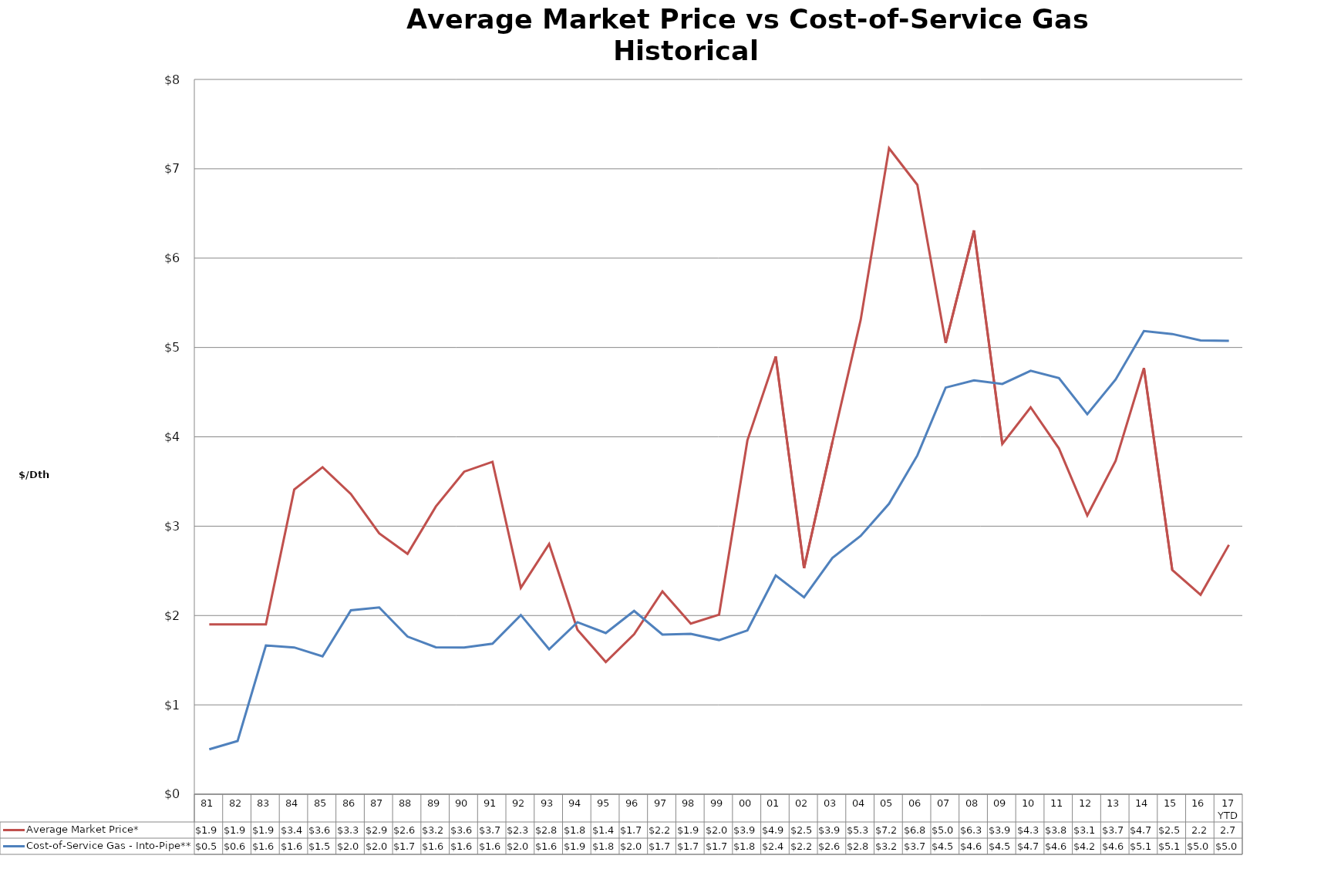
| Category | Average Market Price* | Cost-of-Service Gas - Into-Pipe** |
|---|---|---|
| 81 | 1.9 | 0.502 |
| 82 | 1.9 | 0.596 |
| 83 | 1.9 | 1.665 |
| 84 | 3.41 | 1.643 |
| 85 | 3.66 | 1.543 |
| 86 | 3.36 | 2.059 |
| 87 | 2.92 | 2.091 |
| 88 | 2.69 | 1.764 |
| 89 | 3.22 | 1.644 |
| 90 | 3.61 | 1.642 |
| 91 | 3.72 | 1.685 |
| 92 | 2.31 | 2.005 |
| 93 | 2.8 | 1.623 |
| 94 | 1.84 | 1.926 |
| 95 | 1.48 | 1.804 |
| 96 | 1.79 | 2.052 |
| 97 | 2.27 | 1.787 |
| 98 | 1.91 | 1.795 |
| 99 | 2.01 | 1.725 |
| 00 | 3.96 | 1.833 |
| 01 | 4.9 | 2.448 |
| 02 | 2.53 | 2.204 |
| 03 | 3.94 | 2.644 |
| 04 | 5.31 | 2.891 |
| 05 | 7.23 | 3.251 |
| 06 | 6.82 | 3.792 |
| 07 | 5.05 | 4.551 |
| 08 | 6.31 | 4.632 |
| 09 | 3.92 | 4.592 |
| 10 | 4.33 | 4.74 |
| 11 | 3.87 | 4.658 |
| 12 | 3.12 | 4.253 |
| 13 | 3.73 | 4.641 |
| 14 | 4.77 | 5.184 |
| 15 | 2.51 | 5.151 |
| 16 | 2.233 | 5.079 |
| 17 YTD | 2.791 | 5.074 |